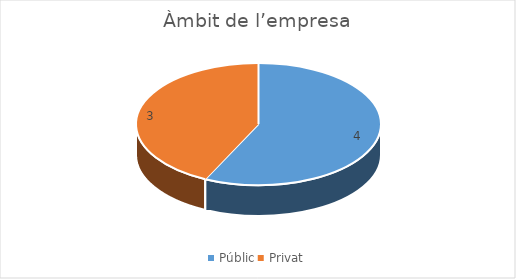
| Category | Series 0 |
|---|---|
| Públic | 4 |
| Privat | 3 |